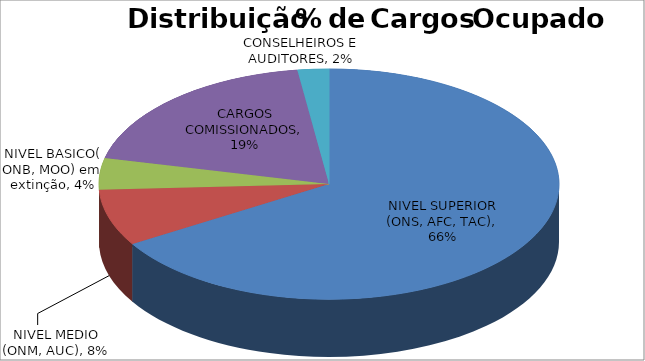
| Category | Series 0 |
|---|---|
| NIVEL SUPERIOR (ONS, AFC, TAC) | 0.663 |
| NIVEL MEDIO (ONM, AUC) | 0.079 |
| NIVEL BASICO( ONB, MOO) em extinção | 0.044 |
| CARGOS COMISSIONADOS | 0.192 |
| CONSELHEIROS E AUDITORES | 0.022 |